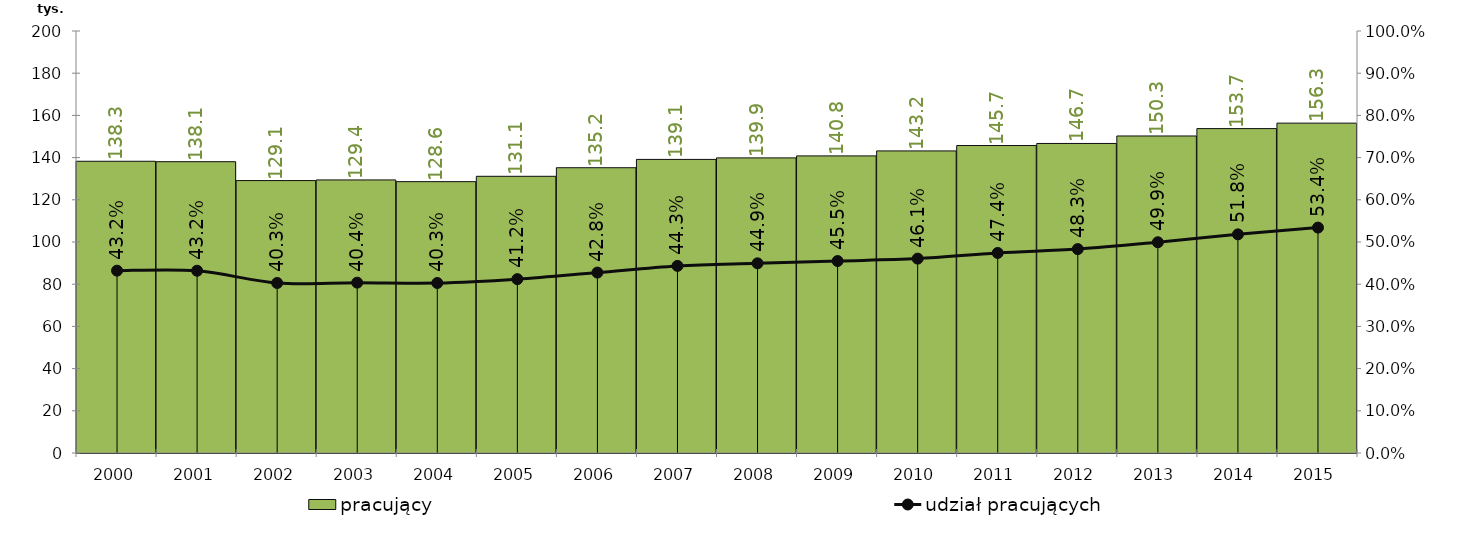
| Category | pracujący |
|---|---|
| 2000.0 | 138258 |
| 2001.0 | 138058 |
| 2002.0 | 129107 |
| 2003.0 | 129414 |
| 2004.0 | 128602 |
| 2005.0 | 131132 |
| 2006.0 | 135199 |
| 2007.0 | 139138 |
| 2008.0 | 139866 |
| 2009.0 | 140803 |
| 2010.0 | 143170 |
| 2011.0 | 145724 |
| 2012.0 | 146699 |
| 2013.0 | 150251 |
| 2014.0 | 153747 |
| 2015.0 | 156336 |